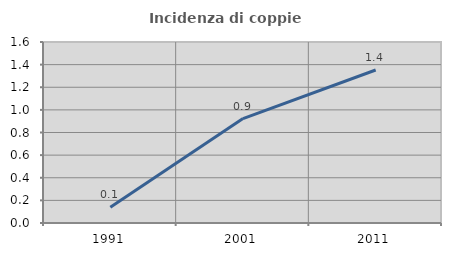
| Category | Incidenza di coppie miste |
|---|---|
| 1991.0 | 0.138 |
| 2001.0 | 0.923 |
| 2011.0 | 1.353 |